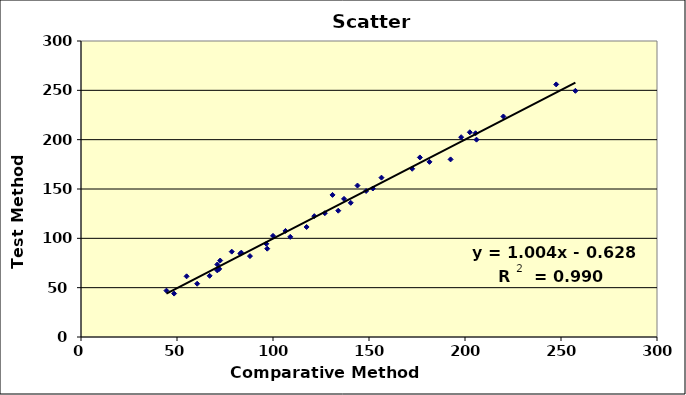
| Category | OLR |
|---|---|
| 83.0 | 84.5 |
| 156.5 | 161.5 |
| 198.0 | 202.5 |
| 48.5 | 44 |
| 72.0 | 69 |
| 176.5 | 182 |
| 220.0 | 223.5 |
| 137.0 | 140 |
| 172.5 | 170.5 |
| 78.5 | 86.5 |
| 148.5 | 148 |
| 247.5 | 256 |
| 44.5 | 47 |
| 97.0 | 89.5 |
| 71.0 | 73.5 |
| 55.0 | 61.5 |
| 152.0 | 150.5 |
| 205.5 | 206.5 |
| 109.0 | 101.5 |
| 121.5 | 122.5 |
| 134.0 | 128 |
| 100.0 | 102.5 |
| 202.5 | 207.5 |
| 71.0 | 67.5 |
| 192.5 | 180 |
| 96.5 | 94.5 |
| 131.0 | 144 |
| 117.5 | 111.5 |
| 88.0 | 82 |
| 206.0 | 200 |
| 144.0 | 153.5 |
| 72.5 | 77.5 |
| 60.5 | 54 |
| 181.5 | 177.5 |
| 257.5 | 249.5 |
| 127.0 | 125.5 |
| 83.5 | 85.5 |
| 67.0 | 62 |
| 140.5 | 136 |
| 106.5 | 107.5 |